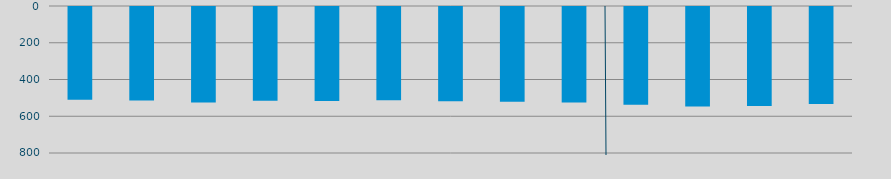
| Category | Energía a bajar | Energía a subir |
|---|---|---|
| A | 504.985 |  |
| M | 508.805 |  |
| J | 519.464 |  |
| J | 510.745 |  |
| A | 512.124 |  |
| S | 507.342 |  |
| O | 513.588 |  |
| N | 515.549 |  |
| D | 519.921 |  |
| E | 531.331 |  |
| F | 542.024 |  |
| M | 539.136 |  |
| A | 527.758 |  |